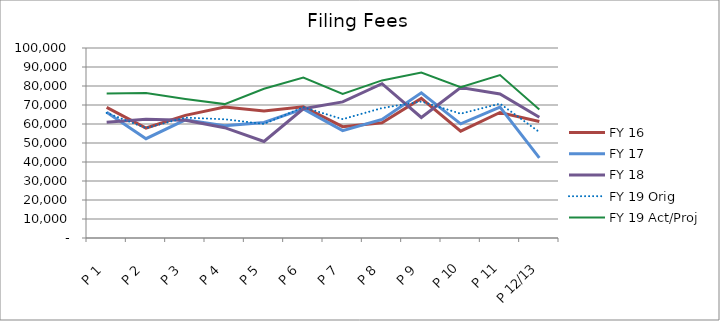
| Category | FY 16 | FY 17 | FY 18 | FY 19 Orig | FY 19 Act/Proj |
|---|---|---|---|---|---|
| P 1 | 68763.56 | 66174.73 | 60920.77 | 65844.311 | 76090.7 |
| P 2 | 57891.14 | 52278.09 | 62520.84 | 57861.129 | 76257.34 |
| P 3 | 64544.28 | 62172.34 | 61945.73 | 63364.423 | 73209.19 |
| P 4 | 68967.13 | 59033.25 | 58067.42 | 62485.786 | 70465.52 |
| P 5 | 66786.62 | 60812.58 | 50778.51 | 60025.47 | 78521.95 |
| P 6 | 69018.3 | 67962.52 | 68013.13 | 68849.166 | 84425.31 |
| P 7 | 58588.39 | 56528.93 | 71650.14 | 62535.8 | 75845.031 |
| P 8 | 60681.8 | 62391.31 | 81223.41 | 68384.938 | 82939.016 |
| P 9 | 73468 | 76442.59 | 63422.48 | 71823.091 | 87108.897 |
| P 10 | 56219.04 | 60096.31 | 79185.13 | 65432.078 | 79357.712 |
| P 11 | 66044.44 | 68890.5 | 75830.76 | 70709.676 | 85758.519 |
| P 12/13 | 61292 | 42201.08 | 63514.8 | 55784.132 | 67656.433 |